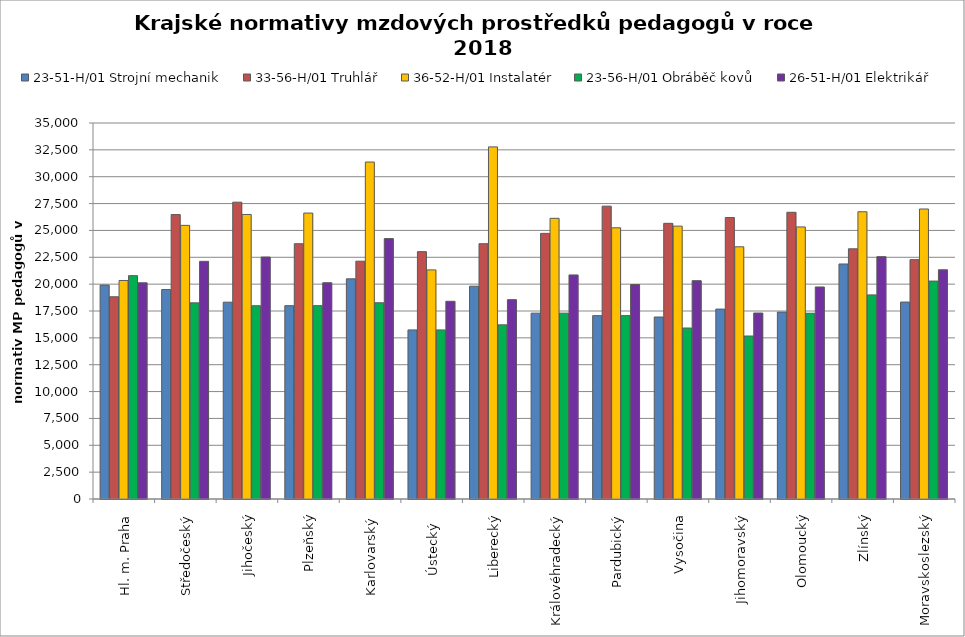
| Category | 23-51-H/01 Strojní mechanik | 33-56-H/01 Truhlář | 36-52-H/01 Instalatér | 23-56-H/01 Obráběč kovů | 26-51-H/01 Elektrikář |
|---|---|---|---|---|---|
| Hl. m. Praha | 19913.684 | 18823.881 | 20341.935 | 20789.011 | 20125.532 |
| Středočeský | 19495.526 | 26474.726 | 25471.833 | 18257.103 | 22122.358 |
| Jihočeský | 18320.543 | 27628.129 | 26485.83 | 17989.186 | 22524.005 |
| Plzeňský | 17997.279 | 23762.874 | 26615.694 | 17997.279 | 20133.942 |
| Karlovarský  | 20494.382 | 22135.922 | 31367.154 | 18267.401 | 24239.203 |
| Ústecký   | 15738.93 | 23024.291 | 21326.25 | 15738.93 | 18404.531 |
| Liberecký | 19807.089 | 23764.087 | 32776.94 | 16209.541 | 18557.17 |
| Královéhradecký | 17300.188 | 24724.513 | 26128.318 | 17300.188 | 20858.244 |
| Pardubický | 17068.692 | 27259.155 | 25244.348 | 17068.692 | 19964.011 |
| Vysočina | 16939.107 | 25660.388 | 25400.255 | 15917.192 | 20324.238 |
| Jihomoravský | 17677.27 | 26199.597 | 23475.107 | 15172.425 | 17311.192 |
| Olomoucký | 17397.336 | 26688.556 | 25325.663 | 17289.85 | 19737.431 |
| Zlínský | 21877.091 | 23288.516 | 26738.667 | 18998.526 | 22560.75 |
| Moravskoslezský | 18331.075 | 22277.647 | 26993.585 | 20284.949 | 21336.338 |